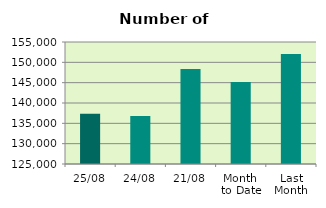
| Category | Series 0 |
|---|---|
| 25/08 | 137378 |
| 24/08 | 136810 |
| 21/08 | 148362 |
| Month 
to Date | 145180.588 |
| Last
Month | 152026.87 |